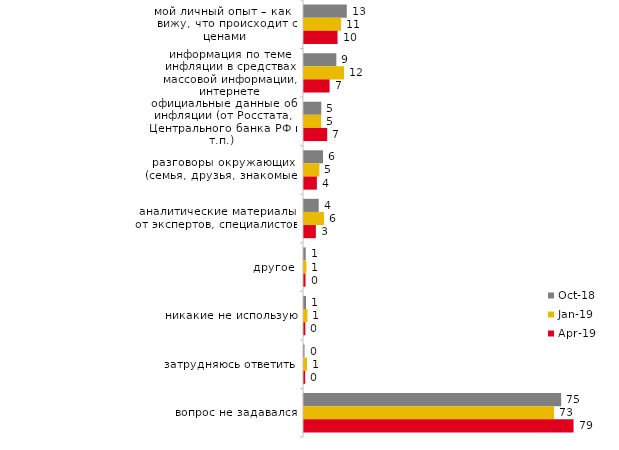
| Category | окт.18 | янв.19 | апр.19 |
|---|---|---|---|
| мой личный опыт – как я вижу, что происходит с ценами | 12.5 | 10.85 | 9.802 |
| информация по теме инфляции в средствах массовой информации, интернете | 9.45 | 11.7 | 7.475 |
| официальные данные об инфляции (от Росстата, Центрального банка РФ и т.п.) | 5.05 | 5 | 6.782 |
| разговоры окружающих (семья, друзья, знакомые) | 5.55 | 4.5 | 3.762 |
| аналитические материалы от экспертов, специалистов | 4.3 | 5.85 | 3.465 |
| другое | 0.5 | 0.7 | 0.446 |
| никакие не использую | 0.6 | 1 | 0.396 |
| затрудняюсь ответить | 0.15 | 0.9 | 0.347 |
| вопрос не задавался | 75.15 | 73.05 | 78.762 |